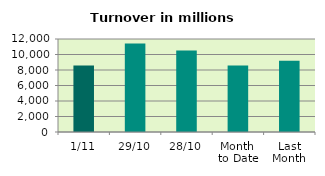
| Category | Series 0 |
|---|---|
| 1/11 | 8577.061 |
| 29/10 | 11412.507 |
| 28/10 | 10523.233 |
| Month 
to Date | 8577.061 |
| Last
Month | 9192.028 |